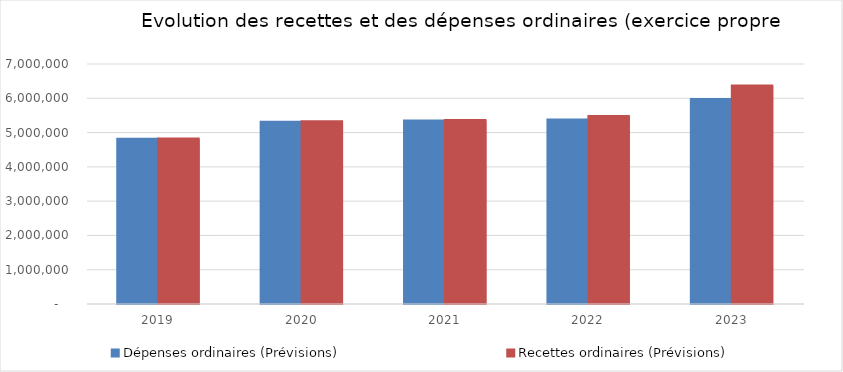
| Category | Dépenses ordinaires (Prévisions) | Recettes ordinaires (Prévisions) |
|---|---|---|
| 2019.0 | 4807906.54 | 4814257.92 |
| 2020.0 | 5301105.39 | 5317195.83 |
| 2021.0 | 5337789.03 | 5353904.68 |
| 2022.0 | 5369697.11 | 5470809.58 |
| 2023.0 | 5962734.61 | 6360742.39 |